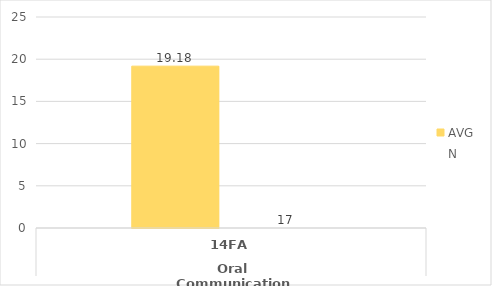
| Category | Mathematics - AVG | Mathematics - N |
|---|---|---|
| 0 | 19.176 | 17 |